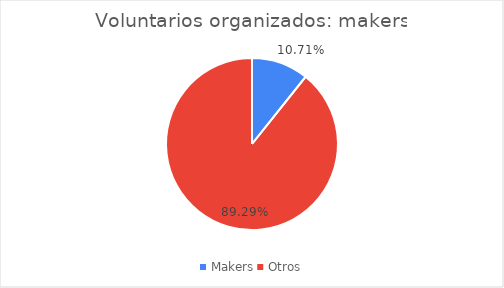
| Category | Series 0 |
|---|---|
| Makers | 0.107 |
| Otros | 0.893 |